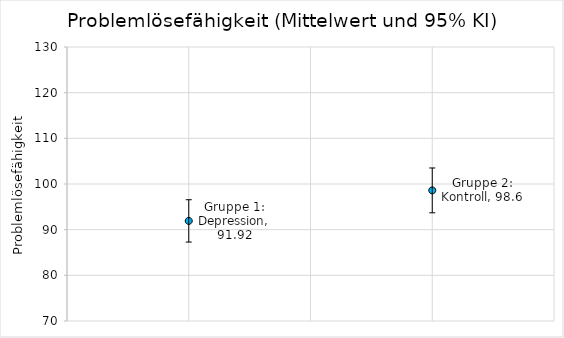
| Category | Series 0 |
|---|---|
| 0 | 91.92 |
| 1 | 98.6 |